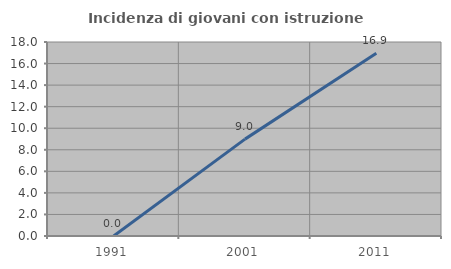
| Category | Incidenza di giovani con istruzione universitaria |
|---|---|
| 1991.0 | 0 |
| 2001.0 | 8.989 |
| 2011.0 | 16.949 |